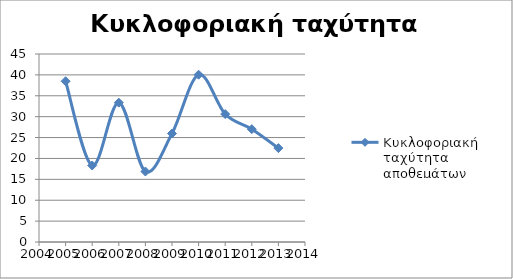
| Category | Κυκλοφοριακή ταχύτητα αποθεμάτων |
|---|---|
| 2005.0 | 38.478 |
| 2006.0 | 18.314 |
| 2007.0 | 33.36 |
| 2008.0 | 16.866 |
| 2009.0 | 25.962 |
| 2010.0 | 40.047 |
| 2011.0 | 30.622 |
| 2012.0 | 27.008 |
| 2013.0 | 22.466 |